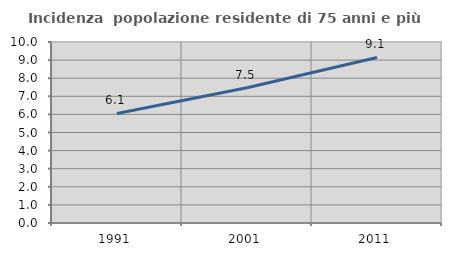
| Category | Incidenza  popolazione residente di 75 anni e più |
|---|---|
| 1991.0 | 6.055 |
| 2001.0 | 7.476 |
| 2011.0 | 9.147 |